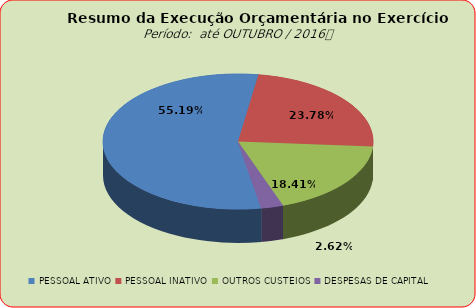
| Category | Series 0 |
|---|---|
| PESSOAL ATIVO | 111532484.48 |
| PESSOAL INATIVO | 48056965.61 |
| OUTROS CUSTEIOS | 37201831.32 |
| DESPESAS DE CAPITAL | 5295170.47 |